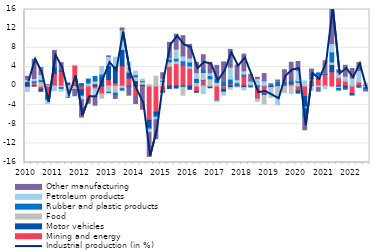
| Category | Mining and energy | Motor vehicles | Food  | Rubber and plastic products | Petroleum products | Other manufacturing |
|---|---|---|---|---|---|---|
| 2010 | -0.25 | 0.917 | 0.255 | -0.052 | -0.879 | 0.861 |
| II | 0.533 | -0.006 | 0.112 | 0.442 | 0.263 | 4.234 |
| III | -0.658 | -0.442 | 0.905 | 0.421 | 0.821 | 1.732 |
| IV | -1.977 | -0.557 | 0.067 | -0.479 | -0.692 | 0.217 |
| 2011 | 2.629 | 1.148 | -0.147 | 0.26 | -0.854 | 3.398 |
| II | 3.096 | 0.115 | -0.324 | -0.379 | -0.372 | 1.665 |
| III | 0.396 | 0.213 | -0.786 | -0.054 | -1.543 | -0.157 |
| IV | 4.311 | -0.093 | -0.663 | -0.13 | 0.016 | -1.363 |
| 2012 | -0.795 | -1.326 | -0.05 | 0.507 | -0.692 | -3.847 |
| II | -2.992 | -0.038 | 0.619 | 0.964 | 0.007 | -0.81 |
| III | -0.594 | 0.455 | 0.596 | 0.935 | -1.603 | -2.027 |
| IV | -1.693 | 1.755 | -0.844 | 0.748 | 1.327 | 0.117 |
| 2013 | 1.379 | 2.888 | -1.307 | -0.096 | 1.688 | 0.348 |
| II | 0.67 | 3.522 | -1.489 | -0.51 | 1.83 | -0.806 |
| III | 4.231 | 3.434 | -0.568 | -0.304 | 3.797 | 0.673 |
| IV | 1.696 | 1.208 | 1.158 | -0.334 | 0.847 | -1.596 |
| 2014 | -2.161 | 1.13 | 0.807 | 0.393 | 0.802 | -1.723 |
| II | -0.11 | 0.347 | 0.545 | 0.211 | 0.344 | -4.95 |
| III | -7.18 | -1.514 | 0.263 | -0.321 | -0.737 | -5.186 |
| IV | -5.474 | -0.682 | 2.045 | -0.385 | -0.515 | -4.159 |
| 2015 | -1.166 | -0.124 | 0.988 | 0.199 | 0.193 | 1.4 |
| II | 4.108 | -0.512 | 0.939 | 0.612 | 0.045 | 3.428 |
| III | 4.672 | -0.433 | 0.58 | 0.533 | 1.685 | 3.367 |
| IV | 4.374 | -0.256 | -1.658 | 0.889 | 0.776 | 4.489 |
| 2016 | 3.704 | -0.676 | 0.466 | 0.847 | 0.604 | 3.087 |
| II | -1.157 | -0.153 | 0.726 | 0.855 | 0.971 | 2.402 |
| III | 1.195 | 0.118 | 1.515 | 0.608 | -1.596 | 3.097 |
| IV | -0.146 | -0.226 | 1.508 | 0.71 | 0.276 | 2.462 |
| 2017 | -3.027 | -0.05 | 0.748 | 0.731 | -0.158 | 2.839 |
| II | -0.719 | -0.58 | 0.035 | 0.706 | -0.624 | 4.3 |
| III | 0.456 | -0.334 | -0.348 | 0.978 | 2.27 | 3.953 |
| IV | -0.07 | 0.021 | -0.156 | 0.647 | 0.422 | 3.284 |
| 2018 | 2.099 | -0.328 | -0.488 | 0.366 | 0.453 | 3.762 |
| II | 0.302 | 0.019 | -0.018 | -0.182 | 0.477 | 1.645 |
| III | -2.651 | -0.029 | -0.529 | 0.253 | 1.076 | 0.486 |
| IV | -1.597 | -0.347 | -1.812 | 0.072 | 0.771 | 1.766 |
| 2019 | -0.079 | -0.235 | -0.646 | 0.265 | -1.418 | 0.224 |
| II | 0.197 | -0.13 | -1.544 | 0.553 | -2.246 | 0.509 |
| III | 0.401 | -0.045 | -1.239 | 0.42 | -0.078 | 2.588 |
| IV | 0.463 | 0.224 | -1.281 | 0.441 | -0.334 | 3.839 |
| 2020 | -1.019 | -0.467 | 0.75 | 0.317 | 1.951 | 2.101 |
| II | -2.182 | -2.255 | -0.246 | -1.832 | 1.059 | -2.852 |
| III | 1.043 | -0.11 | 0.514 | 0.101 | -0.806 | 1.889 |
| IV | 1.474 | 0.245 | 0.531 | 0.493 | -0.344 | -0.959 |
| 2021 | 2.445 | 0.03 | -0.035 | 0.003 | -0.503 | 2.806 |
| II | 2.988 | 1.491 | 0.544 | 2.092 | 1.564 | 7.674 |
| III | 1.715 | -0.231 | -0.289 | -0.332 | 0.949 | 0.73 |
| IV | 1.066 | -0.406 | 0.014 | -0.279 | 0.727 | 2.524 |
| 2022 | -1.6 | -0.217 | 0.296 | -0.066 | 1.111 | 2.253 |
| II | 0.831 | -0.029 | 0.437 | -0.251 | 1.749 | 1.879 |
| III | 0.065 | 0.199 | -0.369 | -0.392 | 0.363 | -0.5 |